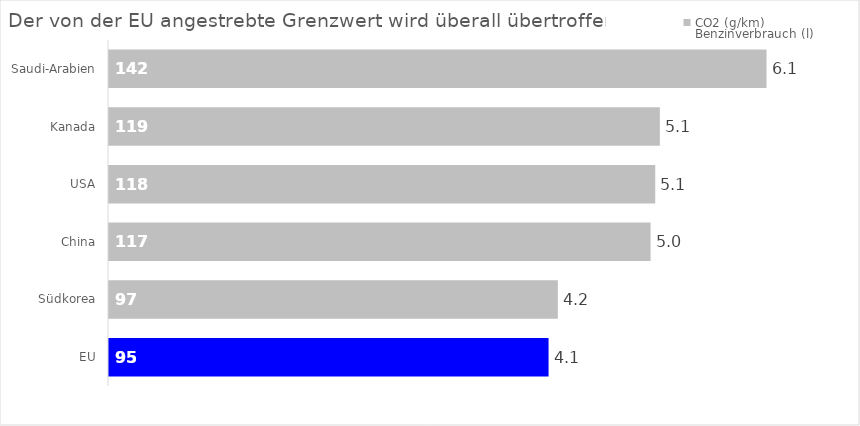
| Category | CO2 (g/km) | Benzinverbrauch (l) |
|---|---|---|
| Saudi-Arabien | 142 | 6.1 |
| Kanada | 119 | 5.1 |
| USA | 118 | 5.1 |
| China | 117 | 5 |
| Südkorea | 97 | 4.2 |
| EU | 95 | 4.1 |